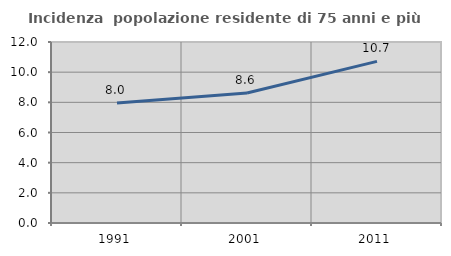
| Category | Incidenza  popolazione residente di 75 anni e più |
|---|---|
| 1991.0 | 7.959 |
| 2001.0 | 8.618 |
| 2011.0 | 10.716 |